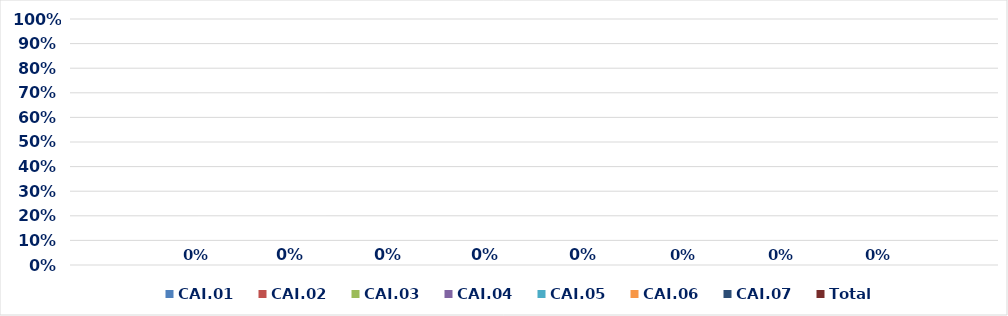
| Category | CAI.01 | CAI.02 | CAI.03 | CAI.04 | CAI.05 | CAI.06 | CAI.07 | Total |
|---|---|---|---|---|---|---|---|---|
| 0 | 0 | 0 | 0 | 0 | 0 | 0 | 0 | 0 |